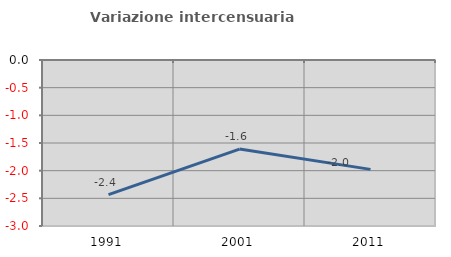
| Category | Variazione intercensuaria annua |
|---|---|
| 1991.0 | -2.433 |
| 2001.0 | -1.61 |
| 2011.0 | -1.976 |